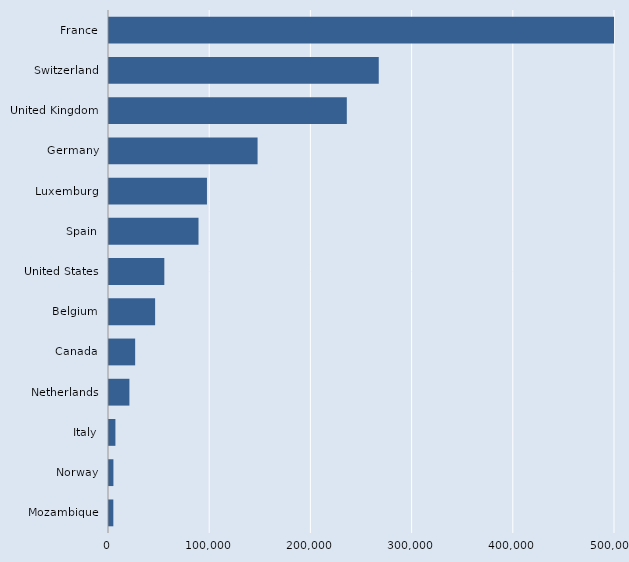
| Category | Series 0 |
|---|---|
| Mozambique | 4279 |
| Norway | 4360 |
| Italy | 6338 |
| Netherlands | 20166 |
| Canada | 25855 |
| Belgium | 45569 |
| United States | 54669 |
| Spain | 88451 |
| Luxemburg | 96800 |
| Germany | 146810 |
| United Kingdom | 235000 |
| Switzerland | 266557 |
| France | 541569 |